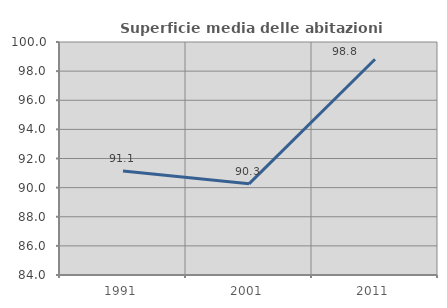
| Category | Superficie media delle abitazioni occupate |
|---|---|
| 1991.0 | 91.148 |
| 2001.0 | 90.259 |
| 2011.0 | 98.813 |